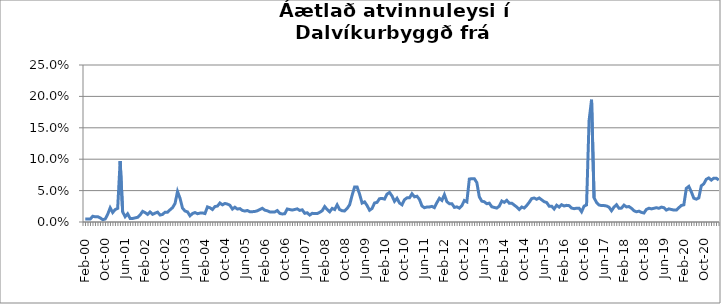
| Category | Series 0 |
|---|---|
| feb.00 | 0.005 |
| mar.00 | 0.005 |
| apr.00 | 0.005 |
| maí.00 | 0.009 |
| jún.00 | 0.008 |
| júl.00 | 0.008 |
| ágú.00 | 0.007 |
| sep.00 | 0.004 |
| okt.00 | 0.005 |
| nóv.00 | 0.012 |
| des.00 | 0.023 |
| jan.01 | 0.015 |
| feb.01 | 0.02 |
| mar.01 | 0.022 |
| apr.01 | 0.097 |
| maí.01 | 0.016 |
| jún.01 | 0.008 |
| júl.01 | 0.013 |
| ágú.01 | 0.006 |
| sep.01 | 0.006 |
| okt.01 | 0.007 |
| nóv.01 | 0.007 |
| des.01 | 0.011 |
| jan.02 | 0.017 |
| feb.02 | 0.015 |
| mar.02 | 0.012 |
| apr.02 | 0.016 |
| maí.02 | 0.012 |
| jún.02 | 0.014 |
| júl.02 | 0.016 |
| ágú.02 | 0.011 |
| sep.02 | 0.012 |
| okt.02 | 0.016 |
| nóv.02 | 0.016 |
| des.02 | 0.019 |
| jan.03 | 0.023 |
| feb.03 | 0.029 |
| mar.03 | 0.049 |
| apr.03 | 0.038 |
| maí.03 | 0.022 |
| jún.03 | 0.018 |
| júl.03 | 0.016 |
| ágú.03 | 0.01 |
| sep.03 | 0.013 |
| okt.03 | 0.015 |
| nóv.03 | 0.013 |
| des.03 | 0.014 |
| jan.04 | 0.014 |
| feb.04 | 0.013 |
| mar.04 | 0.024 |
| apr.04 | 0.023 |
| maí.04 | 0.02 |
| jún.04 | 0.025 |
| júl.04 | 0.025 |
| ágú.04 | 0.03 |
| sep.04 | 0.027 |
| okt.04 | 0.03 |
| nóv.04 | 0.029 |
| des.04 | 0.027 |
| jan.05 | 0.021 |
| feb.05 | 0.024 |
| mar.05 | 0.021 |
| apr.05 | 0.021 |
| maí.05 | 0.018 |
| jún.05 | 0.017 |
| júl.05 | 0.018 |
| ágú.05 | 0.016 |
| sep.05 | 0.016 |
| okt.05 | 0.017 |
| nóv.05 | 0.018 |
| des.05 | 0.02 |
| jan.06 | 0.022 |
| feb.06 | 0.019 |
| mar.06 | 0.018 |
| apr.06 | 0.016 |
| maí.06 | 0.016 |
| jún.06 | 0.016 |
| júl.06 | 0.018 |
| ágú.06 | 0.014 |
| sep.06 | 0.013 |
| okt.06 | 0.013 |
| nóv.06 | 0.021 |
| des.06 | 0.02 |
| jan.07 | 0.019 |
| feb.07 | 0.02 |
| mar.07 | 0.021 |
| apr.07 | 0.018 |
| maí.07 | 0.019 |
| jún.07 | 0.014 |
| júl.07 | 0.015 |
| ágú.07 | 0.011 |
| sep.07 | 0.014 |
| okt.07 | 0.013 |
| nóv.07 | 0.013 |
| des.07 | 0.015 |
| jan.08 | 0.018 |
| feb.08 | 0.025 |
| mar.08 | 0.02 |
| apr.08 | 0.016 |
| maí.08 | 0.022 |
| jún.08 | 0.02 |
| júl.08 | 0.027 |
| ágú.08 | 0.02 |
| sep.08 | 0.018 |
| okt.08 | 0.018 |
| nóv.08 | 0.022 |
| des.08 | 0.027 |
| jan.09 | 0.043 |
| feb.09 | 0.056 |
| mar.09 | 0.056 |
| apr.09 | 0.044 |
| maí.09 | 0.03 |
| jún.09 | 0.032 |
| júl.09 | 0.026 |
| ágú.09 | 0.019 |
| sep.09 | 0.022 |
| okt.09 | 0.03 |
| nóv.09 | 0.031 |
| des.09 | 0.037 |
| jan.10 | 0.038 |
| feb.10 | 0.037 |
| mar.10 | 0.044 |
| apr.10 | 0.047 |
| maí.10 | 0.041 |
| jún.10 | 0.033 |
| júl.10 | 0.038 |
| ágú.10 | 0.03 |
| sep.10 | 0.027 |
| okt.10 | 0.036 |
| nóv.10 | 0.038 |
| des.10 | 0.038 |
| jan.11 | 0.045 |
| feb.11 | 0.04 |
| mar.11 | 0.041 |
| apr.11 | 0.036 |
| maí.11 | 0.026 |
| jún.11 | 0.023 |
| júl.11 | 0.024 |
| ágú.11 | 0.024 |
| sep.11 | 0.025 |
| okt.11 | 0.023 |
| nóv.11 | 0.031 |
| des.11 | 0.038 |
| jan.12 | 0.034 |
| feb.12 | 0.044 |
| mar.12 | 0.032 |
| apr.12 | 0.029 |
| maí.12 | 0.029 |
| jún.12 | 0.023 |
| júl.12 | 0.024 |
| ágú.12 | 0.022 |
| sep.12 | 0.026 |
| okt.12 | 0.034 |
| nóv.12 | 0.032 |
| des.12 | 0.068 |
| jan.13 | 0.069 |
| feb.13 | 0.069 |
| mar.13 | 0.063 |
| apr.13 | 0.04 |
| maí.13 | 0.033 |
| jún.13 | 0.032 |
| júl.13 | 0.029 |
| ágú.13 | 0.03 |
| sep.13 | 0.024 |
| okt.13 | 0.023 |
| nóv.13 | 0.022 |
| des.13 | 0.025 |
| jan.14 | 0.033 |
| feb.14 | 0.031 |
| mar.14 | 0.034 |
| apr.14 | 0.03 |
| maí.14 | 0.03 |
| jún.14 | 0.027 |
| júl.14 | 0.024 |
| ágú.14 | 0.02 |
| sep.14 | 0.024 |
| okt.14 | 0.022 |
| nóv.14 | 0.026 |
| des.14 | 0.031 |
| jan.15 | 0.037 |
| feb.15 | 0.038 |
| mar.15 | 0.036 |
| apr.15 | 0.038 |
| maí.15 | 0.035 |
| jún.15 | 0.032 |
| júl.15 | 0.031 |
| ágú.15 | 0.025 |
| sep.15 | 0.025 |
| okt.15 | 0.021 |
| nóv.15 | 0.027 |
| des.15 | 0.024 |
| jan.16 | 0.028 |
| feb.16 | 0.026 |
| mar.16 | 0.027 |
| apr.16 | 0.026 |
| maí.16 | 0.022 |
| jún.16 | 0.021 |
| júl.16 | 0.022 |
| ágú.16 | 0.022 |
| sep.16 | 0.016 |
| okt.16 | 0.025 |
| nóv.16 | 0.027 |
| des.16 | 0.161 |
| jan.17 | 0.195 |
| feb.17 | 0.039 |
| mar.17 | 0.031 |
| apr.17 | 0.027 |
| maí.17 | 0.026 |
| jún.17 | 0.026 |
| júl.17 | 0.025 |
| ágú.17 | 0.024 |
| sep.17 | 0.018 |
| okt.17 | 0.024 |
| nóv.17 | 0.028 |
| des.17 | 0.022 |
| jan.18 | 0.022 |
| feb.18 | 0.027 |
| mar.18 | 0.024 |
| apr.18 | 0.025 |
| maí.18 | 0.022 |
| jún.18 | 0.018 |
| júl.18 | 0.016 |
| ágú.18 | 0.017 |
| sep.18 | 0.015 |
| okt.18 | 0.014 |
| nóv.18 | 0.02 |
| des.18 | 0.022 |
| jan.19 | 0.021 |
| feb.19 | 0.022 |
| mar.19 | 0.023 |
| apr.19 | 0.022 |
| maí.19 | 0.024 |
| jún.19 | 0.023 |
| júl.19 | 0.019 |
| ágú.19 | 0.021 |
| sep.19 | 0.02 |
| okt.19 | 0.019 |
| nóv.19 | 0.019 |
| des.19 | 0.023 |
| jan.20 | 0.026 |
| feb.20 | 0.027 |
| mar.2020* | 0.054 |
| apr.20 | 0.057 |
| maí.20 | 0.048 |
| jún.20 | 0.038 |
| júl.20 | 0.036 |
| ágú.20 | 0.038 |
| sep.20 | 0.058 |
| okt.20 | 0.061 |
| nóv.20 | 0.068 |
| des.20 | 0.07 |
| jan.21 | 0.067 |
| feb.21 | 0.07 |
| mar.21 | 0.07 |
| apr.21 | 0.067 |